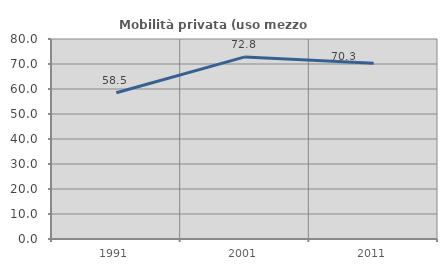
| Category | Mobilità privata (uso mezzo privato) |
|---|---|
| 1991.0 | 58.515 |
| 2001.0 | 72.844 |
| 2011.0 | 70.276 |